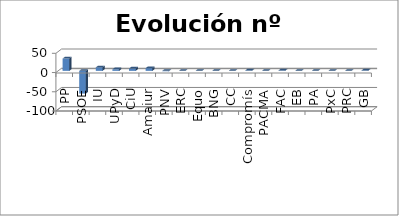
| Category | Dif. |
|---|---|
| PP | 32 |
| PSOE | -59 |
| IU | 9 |
| UPyD | 4 |
| CiU | 6 |
| Amaiur | 7 |
| PNV | -1 |
| ERC | 0 |
| Equo | 0 |
| BNG | 0 |
| CC | 0 |
| Compromís | 1 |
| PACMA | 0 |
| FAC | 1 |
| EB | 0 |
| PA | 0 |
| PxC | 0 |
| PRC | 0 |
| GB | 1 |